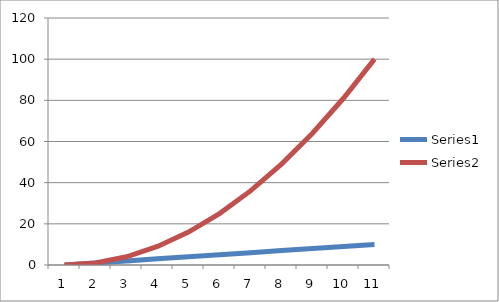
| Category | Series 0 | Series 1 |
|---|---|---|
| 0 | 0 | 0 |
| 1 | 1 | 1 |
| 2 | 2 | 4 |
| 3 | 3 | 9 |
| 4 | 4 | 16 |
| 5 | 5 | 25 |
| 6 | 6 | 36 |
| 7 | 7 | 49 |
| 8 | 8 | 64 |
| 9 | 9 | 81 |
| 10 | 10 | 100 |